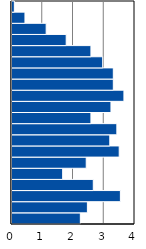
| Category | Series 0 |
|---|---|
| 0-4 | 2.222 |
| 5-9 | 2.452 |
| 10-14 | 3.525 |
| 15-19 | 2.644 |
| 20-24 | 1.648 |
| 25-29 | 2.414 |
| 30-34 | 3.487 |
| 35-39 | 3.18 |
| 40-44 | 3.41 |
| 45-49 | 2.567 |
| 50-54 | 3.218 |
| 55-59 | 3.64 |
| 60-64 | 3.295 |
| 65-69 | 3.295 |
| 70-74 | 2.95 |
| 75-79 | 2.567 |
| 80-84 | 1.762 |
| 85-89 | 1.111 |
| 90-94 | 0.421 |
| 95+ | 0.077 |